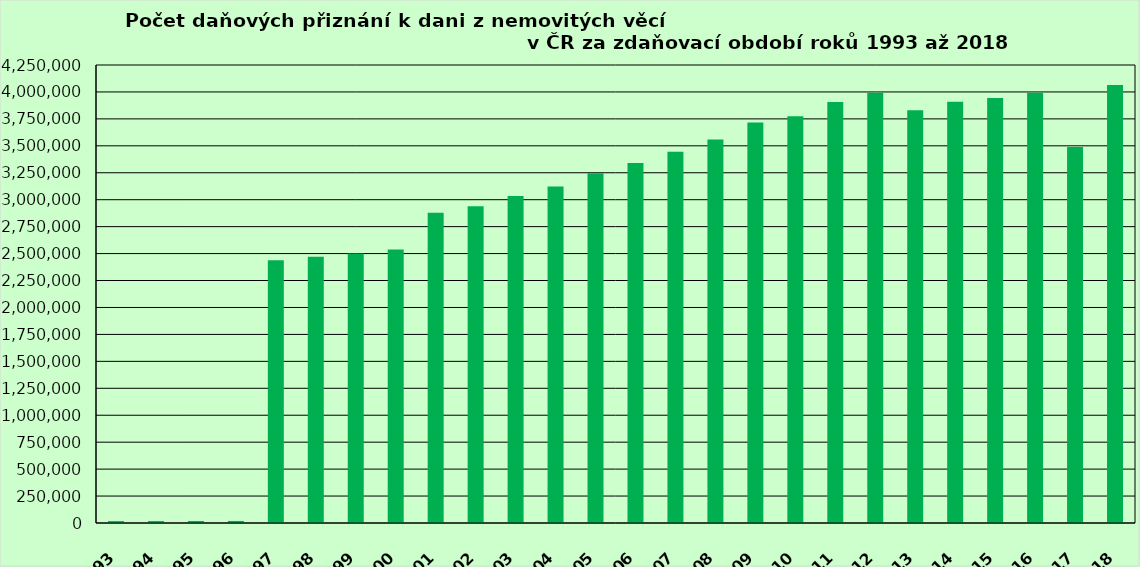
| Category | Series 0 |
|---|---|
| 1993.0 | 17588 |
| 1994.0 | 17987 |
| 1995.0 | 18600 |
| 1996.0 | 18996 |
| 1997.0 | 2439143 |
| 1998.0 | 2470419 |
| 1999.0 | 2500868 |
| 2000.0 | 2536826 |
| 2001.0 | 2879285 |
| 2002.0 | 2938433 |
| 2003.0 | 3034585 |
| 2004.0 | 3121985 |
| 2005.0 | 3246310 |
| 2006.0 | 3340780 |
| 2007.0 | 3446095 |
| 2008.0 | 3558492 |
| 2009.0 | 3715437 |
| 2010.0 | 3775003 |
| 2011.0 | 3906128 |
| 2012.0 | 3992700 |
| 2013.0 | 3830554 |
| 2014.0 | 3907859 |
| 2015.0 | 3942889 |
| 2016.0 | 3991382 |
| 2017.0 | 3490011 |
| 2018.0 | 4064464 |